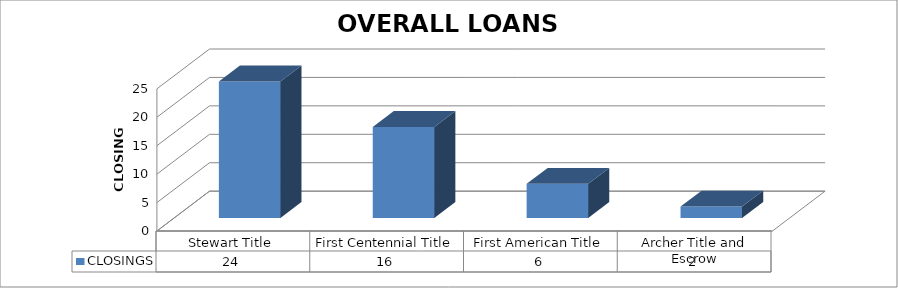
| Category | CLOSINGS |
|---|---|
| Stewart Title | 24 |
| First Centennial Title | 16 |
| First American Title | 6 |
| Archer Title and Escrow | 2 |